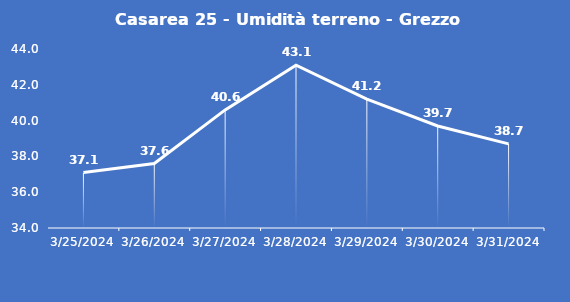
| Category | Casarea 25 - Umidità terreno - Grezzo (%VWC) |
|---|---|
| 3/25/24 | 37.1 |
| 3/26/24 | 37.6 |
| 3/27/24 | 40.6 |
| 3/28/24 | 43.1 |
| 3/29/24 | 41.2 |
| 3/30/24 | 39.7 |
| 3/31/24 | 38.7 |